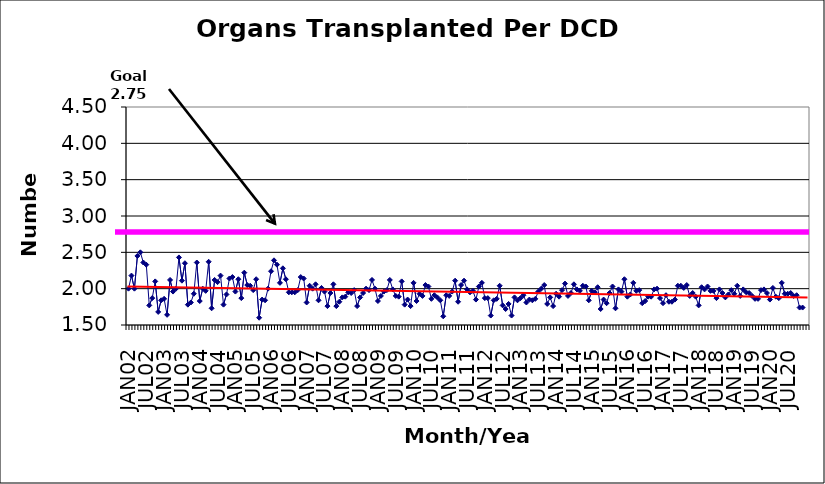
| Category | Series 0 |
|---|---|
| JAN02 | 2 |
| FEB02 | 2.18 |
| MAR02 | 2 |
| APR02 | 2.45 |
| MAY02 | 2.5 |
| JUN02 | 2.36 |
| JUL02 | 2.33 |
| AUG02 | 1.77 |
| SEP02 | 1.87 |
| OCT02 | 2.1 |
| NOV02 | 1.68 |
| DEC02 | 1.84 |
| JAN03 | 1.86 |
| FEB03 | 1.64 |
| MAR03 | 2.12 |
| APR03 | 1.96 |
| MAY03 | 2 |
| JUN03 | 2.43 |
| JUL03 | 2.11 |
| AUG03 | 2.35 |
| SEP03 | 1.78 |
| OCT03 | 1.81 |
| NOV03 | 1.93 |
| DEC03 | 2.36 |
| JAN04 | 1.83 |
| FEB04 | 2 |
| MAR04 | 1.97 |
| APR04 | 2.37 |
| MAY04 | 1.73 |
| JUN04 | 2.12 |
| JUL04 | 2.09 |
| AUG04 | 2.18 |
| SEP04 | 1.78 |
| OCT04 | 1.92 |
| NOV04 | 2.14 |
| DEC04 | 2.16 |
| JAN05 | 1.96 |
| FEB05 | 2.13 |
| MAR05 | 1.87 |
| APR05 | 2.22 |
| MAY05 | 2.05 |
| JUN05 | 2.04 |
| JUL05 | 1.98 |
| AUG05 | 2.13 |
| SEP05 | 1.6 |
| OCT05 | 1.85 |
| NOV05 | 1.84 |
| DEC05 | 2 |
| JAN06 | 2.24 |
| FEB06 | 2.39 |
| MAR06 | 2.33 |
| APR06 | 2.08 |
| MAY06 | 2.28 |
| JUN06 | 2.13 |
| JUL06 | 1.95 |
| AUG06 | 1.95 |
| SEP06 | 1.95 |
| OCT06 | 1.98 |
| NOV06 | 2.16 |
| DEC06 | 2.14 |
| JAN07 | 1.81 |
| FEB07 | 2.04 |
| MAR07 | 2 |
| APR07 | 2.06 |
| MAY07 | 1.84 |
| JUN07 | 2.01 |
| JUL07 | 1.96 |
| AUG07 | 1.76 |
| SEP07 | 1.94 |
| OCT07 | 2.06 |
| NOV07 | 1.76 |
| DEC07 | 1.82 |
| JAN08 | 1.88 |
| FEB08 | 1.89 |
| MAR08 | 1.95 |
| APR08 | 1.94 |
| MAY08 | 1.98 |
| JUN08 | 1.76 |
| JUL08 | 1.88 |
| AUG08 | 1.94 |
| SEP08 | 2 |
| OCT08 | 1.98 |
| NOV08 | 2.12 |
| DEC08 | 2 |
| JAN09 | 1.83 |
| FEB09 | 1.9 |
| MAR09 | 1.96 |
| APR09 | 1.98 |
| MAY09 | 2.12 |
| JUN09 | 1.99 |
| JUL09 | 1.9 |
| AUG09 | 1.89 |
| SEP09 | 2.1 |
| OCT09 | 1.78 |
| NOV09 | 1.85 |
| DEC09 | 1.76 |
| JAN10 | 2.08 |
| FEB10 | 1.83 |
| MAR10 | 1.93 |
| APR10 | 1.9 |
| MAY10 | 2.05 |
| JUN10 | 2.03 |
| JUL10 | 1.86 |
| AUG10 | 1.91 |
| SEP10 | 1.88 |
| OCT10 | 1.84 |
| NOV10 | 1.62 |
| DEC10 | 1.91 |
| JAN11 | 1.9 |
| FEB11 | 1.96 |
| MAR11 | 2.11 |
| APR11 | 1.82 |
| MAY11 | 2.05 |
| JUN11 | 2.11 |
| JUL11 | 1.99 |
| AUG11 | 1.95 |
| SEP11 | 1.97 |
| OCT11 | 1.85 |
| NOV11 | 2.03 |
| DEC11 | 2.08 |
| JAN12 | 1.87 |
| FEB12 | 1.87 |
| MAR12 | 1.63 |
| APR12 | 1.84 |
| MAY12 | 1.86 |
| JUN12 | 2.04 |
| JUL12 | 1.77 |
| AUG12 | 1.72 |
| SEP12 | 1.79 |
| OCT12 | 1.63 |
| NOV12 | 1.88 |
| DEC12 | 1.84 |
| JAN13 | 1.87 |
| FEB13 | 1.91 |
| MAR13 | 1.81 |
| APR13 | 1.85 |
| MAY13 | 1.84 |
| JUN13 | 1.86 |
| JUL13 | 1.96 |
| AUG13 | 2 |
| SEP13 | 2.05 |
| OCT13 | 1.79 |
| NOV13 | 1.88 |
| DEC13 | 1.76 |
| JAN14 | 1.93 |
| FEB14 | 1.89 |
| MAR14 | 1.98 |
| APR14 | 2.07 |
| MAY14 | 1.9 |
| JUN14 | 1.94 |
| JUL14 | 2.06 |
| AUG14 | 1.99 |
| SEP14 | 1.97 |
| OCT14 | 2.04 |
| NOV14 | 2.03 |
| DEC14 | 1.84 |
| JAN15 | 1.97 |
| FEB15 | 1.95 |
| MAR15 | 2.02 |
| APR15 | 1.72 |
| MAY15 | 1.85 |
| JUN15 | 1.8 |
| JUL15 | 1.94 |
| AUG15 | 2.03 |
| SEP15 | 1.73 |
| OCT15 | 1.99 |
| NOV15 | 1.96 |
| DEC15 | 2.13 |
| JAN16 | 1.89 |
| FEB16 | 1.92 |
| MAR16 | 2.08 |
| APR16 | 1.97 |
| MAY16 | 1.98 |
| JUN16 | 1.8 |
| JUL16 | 1.83 |
| AUG16 | 1.89 |
| SEP16 | 1.89 |
| OCT16 | 1.99 |
| NOV16 | 2 |
| DEC16 | 1.87 |
| JAN17 | 1.8 |
| FEB17 | 1.91 |
| MAR17 | 1.82 |
| APR17 | 1.82 |
| MAY17 | 1.85 |
| JUN17 | 2.04 |
| JUL17 | 2.04 |
| AUG17 | 2.01 |
| SEP17 | 2.05 |
| OCT17 | 1.9 |
| NOV17 | 1.94 |
| DEC17 | 1.89 |
| JAN18 | 1.77 |
| FEB18 | 2.02 |
| MAR18 | 1.99 |
| APR18 | 2.03 |
| MAY18 | 1.97 |
| JUN18 | 1.97 |
| JUL18 | 1.87 |
| AUG18 | 1.99 |
| SEP18 | 1.94 |
| OCT18 | 1.88 |
| NOV18 | 1.92 |
| DEC18 | 1.98 |
| JAN19 | 1.93 |
| FEB19 | 2.04 |
| MAR19 | 1.9 |
| APR19 | 1.99 |
| MAY19 | 1.95 |
| JUN19 | 1.94 |
| JUL19 | 1.9 |
| AUG19 | 1.86 |
| SEP19 | 1.86 |
| OCT19 | 1.98 |
| NOV19 | 1.99 |
| DEC19 | 1.94 |
| JAN20 | 1.85 |
| FEB20 | 2.01 |
| MAR20 | 1.89 |
| APR20 | 1.87 |
| MAY20 | 2.08 |
| JUN20 | 1.93 |
| JUL20 | 1.93 |
| AUG20 | 1.94 |
| SEP20 | 1.9 |
| OCT20 | 1.91 |
| NOV20 | 1.74 |
| DEC20 | 1.74 |